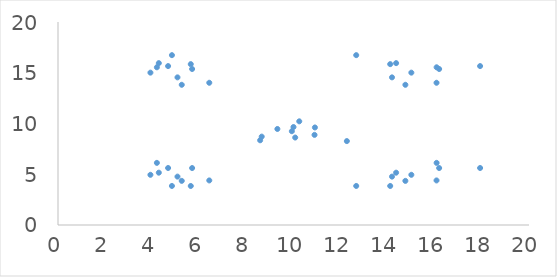
| Category | x2 |
|---|---|
| 3.9248611805141 | 4.946 |
| 6.42376877163096 | 4.39 |
| 4.83796085492435 | 3.847 |
| 5.07355911634957 | 4.766 |
| 5.63797611110035 | 3.845 |
| 4.67504652724002 | 5.616 |
| 4.28086346319376 | 5.155 |
| 4.19892010402685 | 6.121 |
| 5.69496958253675 | 5.611 |
| 5.25501886700086 | 4.347 |
| 8.58352427016797 | 8.347 |
| 9.99998642193724 | 9.653 |
| 10.8927732469235 | 8.88 |
| 10.0725268482187 | 8.617 |
| 12.2655923464648 | 8.267 |
| 10.9091088242579 | 9.609 |
| 10.24436797435 | 10.214 |
| 9.31576173279291 | 9.461 |
| 8.6500808950801 | 8.707 |
| 9.92981588819431 | 9.24 |
| 15.0041930177097 | 15.01 |
| 16.0732827372838 | 14.013 |
| 12.6630188617726 | 16.734 |
| 14.1828605787434 | 14.545 |
| 14.1062423910143 | 15.848 |
| 17.923493976907 | 15.657 |
| 14.3573656419541 | 15.947 |
| 16.077365564055 | 15.537 |
| 16.1844913047207 | 15.369 |
| 14.7505215792486 | 13.814 |
| 3.9248611805141 | 15.01 |
| 6.42376877163096 | 14.013 |
| 4.83796085492435 | 16.734 |
| 5.07355911634957 | 14.545 |
| 5.63797611110035 | 15.848 |
| 4.67504652724002 | 15.657 |
| 4.28086346319376 | 15.947 |
| 4.19892010402685 | 15.537 |
| 5.69496958253675 | 15.369 |
| 5.25501886700086 | 13.814 |
| 15.0041930177097 | 4.946 |
| 16.0732827372838 | 4.39 |
| 12.6630188617726 | 3.847 |
| 14.1828605787434 | 4.766 |
| 14.1062423910143 | 3.845 |
| 17.923493976907 | 5.616 |
| 14.3573656419541 | 5.155 |
| 16.077365564055 | 6.121 |
| 16.1844913047207 | 5.611 |
| 14.7505215792486 | 4.347 |